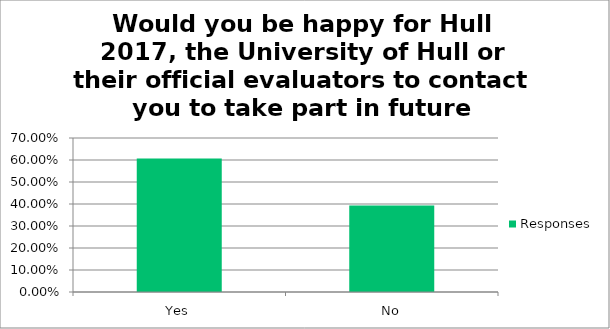
| Category | Responses |
|---|---|
| Yes | 0.607 |
| No | 0.393 |